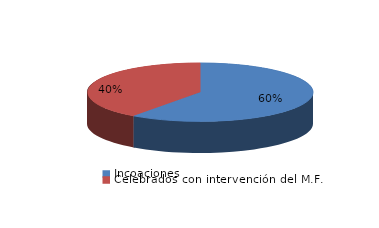
| Category | Series 0 |
|---|---|
| Incoaciones | 6372 |
| Celebrados con intervención del M.F. | 4254 |